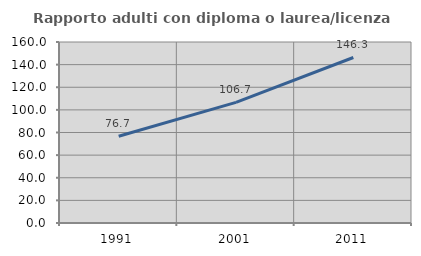
| Category | Rapporto adulti con diploma o laurea/licenza media  |
|---|---|
| 1991.0 | 76.735 |
| 2001.0 | 106.681 |
| 2011.0 | 146.316 |